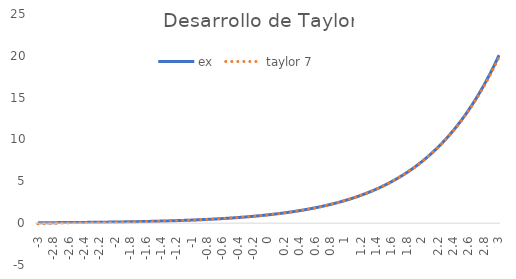
| Category | ex | taylor 7 |
|---|---|---|
| -3.0 | 0.05 | -0.071 |
| -2.95 | 0.052 | -0.054 |
| -2.9000000000000004 | 0.055 | -0.038 |
| -2.8500000000000005 | 0.058 | -0.024 |
| -2.8000000000000007 | 0.061 | -0.01 |
| -2.750000000000001 | 0.064 | 0.002 |
| -2.700000000000001 | 0.067 | 0.014 |
| -2.6500000000000012 | 0.071 | 0.024 |
| -2.6000000000000014 | 0.074 | 0.034 |
| -2.5500000000000016 | 0.078 | 0.044 |
| -2.5000000000000018 | 0.082 | 0.053 |
| -2.450000000000002 | 0.086 | 0.061 |
| -2.400000000000002 | 0.091 | 0.069 |
| -2.3500000000000023 | 0.095 | 0.077 |
| -2.3000000000000025 | 0.1 | 0.085 |
| -2.2500000000000027 | 0.105 | 0.092 |
| -2.200000000000003 | 0.111 | 0.1 |
| -2.150000000000003 | 0.116 | 0.107 |
| -2.100000000000003 | 0.122 | 0.115 |
| -2.0500000000000034 | 0.129 | 0.122 |
| -2.0000000000000036 | 0.135 | 0.13 |
| -1.9500000000000035 | 0.142 | 0.138 |
| -1.9000000000000035 | 0.15 | 0.146 |
| -1.8500000000000034 | 0.157 | 0.154 |
| -1.8000000000000034 | 0.165 | 0.163 |
| -1.7500000000000033 | 0.174 | 0.172 |
| -1.7000000000000033 | 0.183 | 0.181 |
| -1.6500000000000032 | 0.192 | 0.191 |
| -1.6000000000000032 | 0.202 | 0.201 |
| -1.5500000000000032 | 0.212 | 0.212 |
| -1.500000000000003 | 0.223 | 0.223 |
| -1.450000000000003 | 0.235 | 0.234 |
| -1.400000000000003 | 0.247 | 0.246 |
| -1.350000000000003 | 0.259 | 0.259 |
| -1.300000000000003 | 0.273 | 0.272 |
| -1.2500000000000029 | 0.287 | 0.286 |
| -1.2000000000000028 | 0.301 | 0.301 |
| -1.1500000000000028 | 0.317 | 0.317 |
| -1.1000000000000028 | 0.333 | 0.333 |
| -1.0500000000000027 | 0.35 | 0.35 |
| -1.0000000000000027 | 0.368 | 0.368 |
| -0.9500000000000026 | 0.387 | 0.387 |
| -0.9000000000000026 | 0.407 | 0.407 |
| -0.8500000000000025 | 0.427 | 0.427 |
| -0.8000000000000025 | 0.449 | 0.449 |
| -0.7500000000000024 | 0.472 | 0.472 |
| -0.7000000000000024 | 0.497 | 0.497 |
| -0.6500000000000024 | 0.522 | 0.522 |
| -0.6000000000000023 | 0.549 | 0.549 |
| -0.5500000000000023 | 0.577 | 0.577 |
| -0.5000000000000022 | 0.607 | 0.607 |
| -0.45000000000000223 | 0.638 | 0.638 |
| -0.40000000000000224 | 0.67 | 0.67 |
| -0.35000000000000225 | 0.705 | 0.705 |
| -0.30000000000000226 | 0.741 | 0.741 |
| -0.2500000000000023 | 0.779 | 0.779 |
| -0.2000000000000023 | 0.819 | 0.819 |
| -0.1500000000000023 | 0.861 | 0.861 |
| -0.1000000000000023 | 0.905 | 0.905 |
| -0.05000000000000229 | 0.951 | 0.951 |
| 0.0 | 1 | 1 |
| 0.05 | 1.051 | 1.051 |
| 0.1 | 1.105 | 1.105 |
| 0.15000000000000002 | 1.162 | 1.162 |
| 0.2 | 1.221 | 1.221 |
| 0.25 | 1.284 | 1.284 |
| 0.3 | 1.35 | 1.35 |
| 0.35 | 1.419 | 1.419 |
| 0.39999999999999997 | 1.492 | 1.492 |
| 0.44999999999999996 | 1.568 | 1.568 |
| 0.49999999999999994 | 1.649 | 1.649 |
| 0.5499999999999999 | 1.733 | 1.733 |
| 0.6 | 1.822 | 1.822 |
| 0.65 | 1.916 | 1.916 |
| 0.7000000000000001 | 2.014 | 2.014 |
| 0.7500000000000001 | 2.117 | 2.117 |
| 0.8000000000000002 | 2.226 | 2.226 |
| 0.8500000000000002 | 2.34 | 2.34 |
| 0.9000000000000002 | 2.46 | 2.46 |
| 0.9500000000000003 | 2.586 | 2.586 |
| 1.0000000000000002 | 2.718 | 2.718 |
| 1.0500000000000003 | 2.858 | 2.858 |
| 1.1000000000000003 | 3.004 | 3.004 |
| 1.1500000000000004 | 3.158 | 3.158 |
| 1.2000000000000004 | 3.32 | 3.32 |
| 1.2500000000000004 | 3.49 | 3.49 |
| 1.3000000000000005 | 3.669 | 3.669 |
| 1.3500000000000005 | 3.857 | 3.857 |
| 1.4000000000000006 | 4.055 | 4.055 |
| 1.4500000000000006 | 4.263 | 4.263 |
| 1.5000000000000007 | 4.482 | 4.481 |
| 1.5500000000000007 | 4.711 | 4.71 |
| 1.6000000000000008 | 4.953 | 4.952 |
| 1.6500000000000008 | 5.207 | 5.205 |
| 1.7000000000000008 | 5.474 | 5.472 |
| 1.7500000000000009 | 5.755 | 5.752 |
| 1.800000000000001 | 6.05 | 6.046 |
| 1.850000000000001 | 6.36 | 6.356 |
| 1.900000000000001 | 6.686 | 6.681 |
| 1.950000000000001 | 7.029 | 7.022 |
| 2.000000000000001 | 7.389 | 7.381 |
| 2.0500000000000007 | 7.768 | 7.758 |
| 2.1000000000000005 | 8.166 | 8.154 |
| 2.1500000000000004 | 8.585 | 8.57 |
| 2.2 | 9.025 | 9.007 |
| 2.25 | 9.488 | 9.466 |
| 2.3 | 9.974 | 9.948 |
| 2.3499999999999996 | 10.486 | 10.455 |
| 2.3999999999999995 | 11.023 | 10.986 |
| 2.4499999999999993 | 11.588 | 11.545 |
| 2.499999999999999 | 12.182 | 12.131 |
| 2.549999999999999 | 12.807 | 12.746 |
| 2.5999999999999988 | 13.464 | 13.392 |
| 2.6499999999999986 | 14.154 | 14.07 |
| 2.6999999999999984 | 14.88 | 14.781 |
| 2.7499999999999982 | 15.643 | 15.528 |
| 2.799999999999998 | 16.445 | 16.311 |
| 2.849999999999998 | 17.288 | 17.133 |
| 2.8999999999999977 | 18.174 | 17.995 |
| 2.9499999999999975 | 19.106 | 18.898 |
| 2.9999999999999973 | 20.086 | 19.846 |